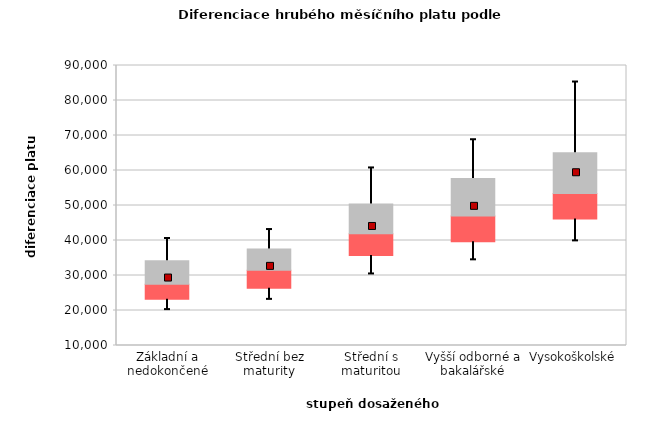
| Category | 0,25 | 0,5 | 0,75 |
|---|---|---|---|
| Základní a nedokončené | 23240.638 | 4234.719 | 6720.844 |
| Střední bez maturity | 26362.547 | 5135.084 | 6049.732 |
| Střední s maturitou | 35741.004 | 6155.686 | 8529.814 |
| Vyšší odborné a bakalářské | 39645.583 | 7350.671 | 10707.156 |
| Vysokoškolské | 46147.444 | 7307.43 | 11609.029 |